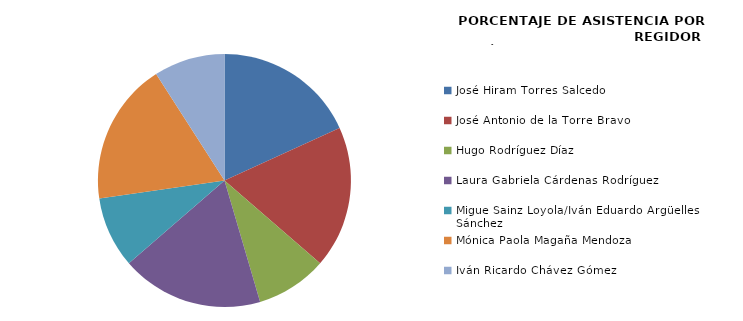
| Category | Series 0 |
|---|---|
| José Hiram Torres Salcedo | 100 |
| José Antonio de la Torre Bravo | 100 |
| Hugo Rodríguez Díaz | 50 |
| Laura Gabriela Cárdenas Rodríguez | 100 |
| Migue Sainz Loyola/Iván Eduardo Argüelles Sánchez | 50 |
| Mónica Paola Magaña Mendoza | 100 |
| Iván Ricardo Chávez Gómez | 50 |